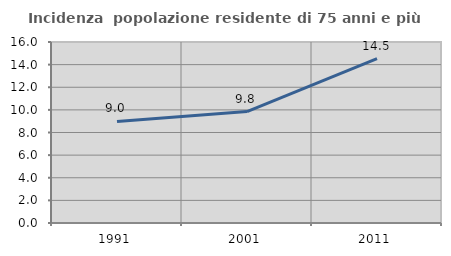
| Category | Incidenza  popolazione residente di 75 anni e più |
|---|---|
| 1991.0 | 8.982 |
| 2001.0 | 9.847 |
| 2011.0 | 14.529 |